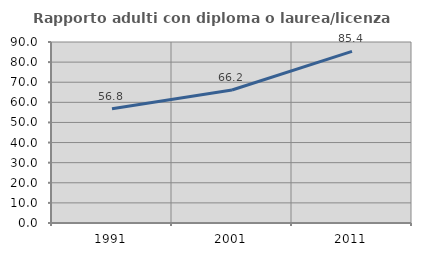
| Category | Rapporto adulti con diploma o laurea/licenza media  |
|---|---|
| 1991.0 | 56.79 |
| 2001.0 | 66.157 |
| 2011.0 | 85.366 |